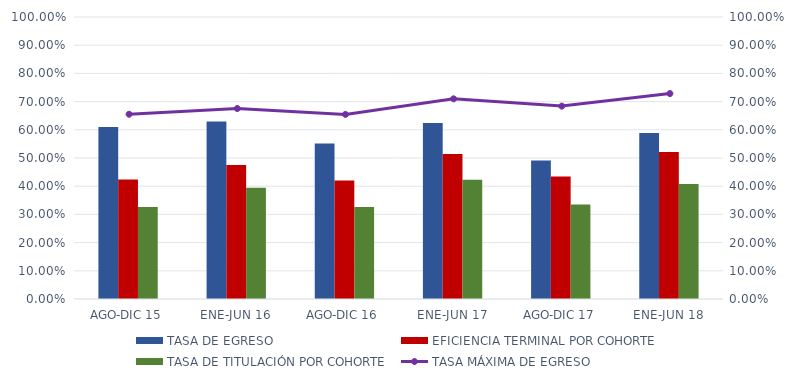
| Category | TASA DE EGRESO | EFICIENCIA TERMINAL POR COHORTE | TASA DE TITULACIÓN POR COHORTE |
|---|---|---|---|
| AGO-DIC 15 | 0.61 | 0.424 | 0.326 |
| ENE-JUN 16 | 0.63 | 0.475 | 0.394 |
| AGO-DIC 16 | 0.551 | 0.42 | 0.326 |
| ENE-JUN 17 | 0.624 | 0.514 | 0.423 |
| AGO-DIC 17 | 0.491 | 0.435 | 0.335 |
| ENE-JUN 18 | 0.589 | 0.521 | 0.408 |